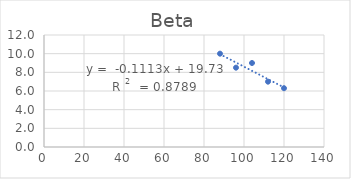
| Category | Series 0 |
|---|---|
| 120.0 | 6.3 |
| 112.0 | 7 |
| 104.0 | 9 |
| 96.0 | 8.5 |
| 88.0 | 10 |